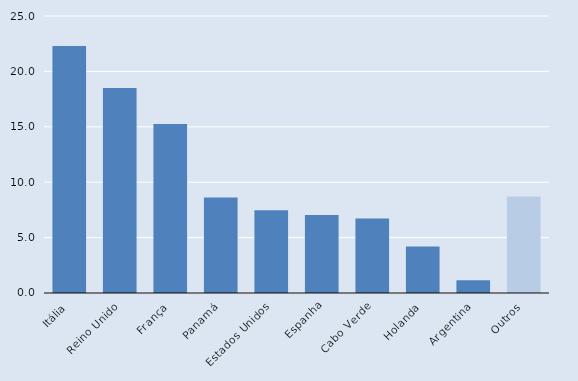
| Category | Series 0 |
|---|---|
| Itália | 22.292 |
| Reino Unido | 18.507 |
| França | 15.247 |
| Panamá | 8.623 |
| Estados Unidos | 7.466 |
| Espanha | 7.045 |
| Cabo Verde | 6.73 |
| Holanda | 4.206 |
| Argentina | 1.157 |
| Outros | 8.7 |